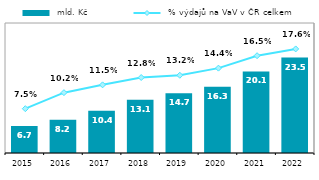
| Category |  mld. Kč |
|---|---|
| 2015.0 | 6.651 |
| 2016.0 | 8.182 |
| 2017.0 | 10.424 |
| 2018.0 | 13.125 |
| 2019.0 | 14.683 |
| 2020.0 | 16.284 |
| 2021.0 | 20.078 |
| 2022.0 | 23.479 |